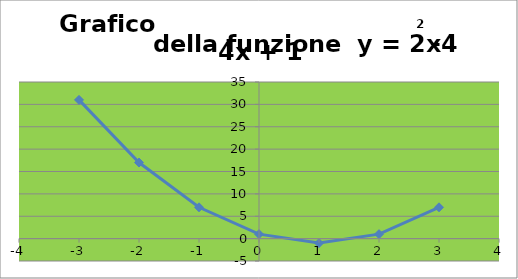
| Category | y |
|---|---|
| -3.0 | 31 |
| -2.0 | 17 |
| -1.0 | 7 |
| 0.0 | 1 |
| 1.0 | -1 |
| 2.0 | 1 |
| 3.0 | 7 |